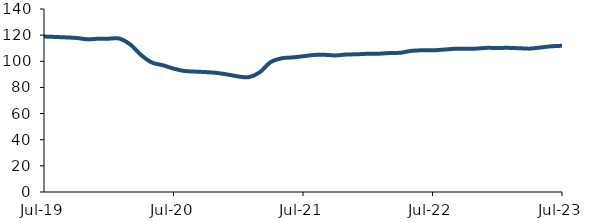
| Category | Series 0 |
|---|---|
| 2019-07-01 | 118.921 |
| 2019-08-01 | 118.635 |
| 2019-09-01 | 118.287 |
| 2019-10-01 | 117.85 |
| 2019-11-01 | 116.835 |
| 2019-12-01 | 117.224 |
| 2020-01-01 | 117.309 |
| 2020-02-01 | 117.318 |
| 2020-03-01 | 112.843 |
| 2020-04-01 | 104.749 |
| 2020-05-01 | 99.065 |
| 2020-06-01 | 97 |
| 2020-07-01 | 94.403 |
| 2020-08-01 | 92.588 |
| 2020-09-01 | 92.095 |
| 2020-10-01 | 91.72 |
| 2020-11-01 | 91.108 |
| 2020-12-01 | 89.884 |
| 2021-01-01 | 88.42 |
| 2021-02-01 | 87.87 |
| 2021-03-01 | 91.662 |
| 2021-04-01 | 99.36 |
| 2021-05-01 | 102.252 |
| 2021-06-01 | 102.937 |
| 2021-07-01 | 103.85 |
| 2021-08-01 | 104.82 |
| 2021-09-01 | 104.952 |
| 2021-10-01 | 104.465 |
| 2021-11-01 | 105.171 |
| 2021-12-01 | 105.344 |
| 2022-01-01 | 105.752 |
| 2022-02-01 | 105.784 |
| 2022-03-01 | 106.289 |
| 2022-04-01 | 106.52 |
| 2022-05-01 | 107.933 |
| 2022-06-01 | 108.418 |
| 2022-07-01 | 108.373 |
| 2022-08-01 | 108.898 |
| 2022-09-01 | 109.553 |
| 2022-10-01 | 109.61 |
| 2022-11-01 | 109.687 |
| 2022-12-01 | 110.251 |
| 2023-01-01 | 110.176 |
| 2023-02-01 | 110.279 |
| 2023-03-01 | 110.001 |
| 2023-04-01 | 109.685 |
| 2023-05-01 | 110.559 |
| 2023-06-01 | 111.451 |
| 2023-07-01 | 111.863 |